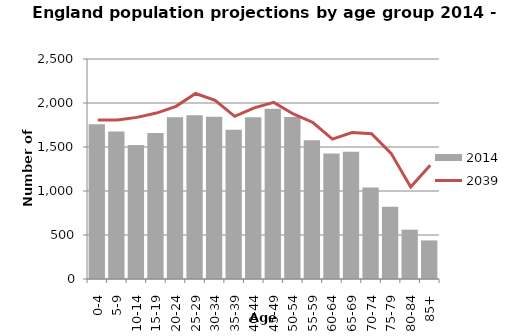
| Category | 2014 |
|---|---|
| 0-4 | 1757.7 |
| 5-9 | 1675.1 |
| 10-14 | 1521.5 |
| 15-19 | 1658.8 |
| 20-24 | 1837.4 |
| 25-29 | 1861.2 |
| 30-34 | 1844.3 |
| 35-39 | 1694.8 |
| 40-44 | 1838.4 |
| 45-49 | 1935.2 |
| 50-54 | 1839.8 |
| 55-59 | 1576.1 |
| 60-64 | 1426.1 |
| 65-69 | 1446.6 |
| 70-74 | 1040.6 |
| 75-79 | 820.4 |
| 80-84 | 560.6 |
| 85+ | 438.6 |